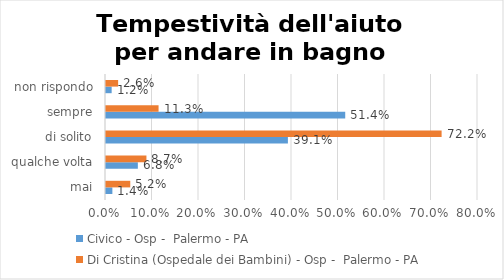
| Category | Civico - Osp -  Palermo - PA | Di Cristina (Ospedale dei Bambini) - Osp -  Palermo - PA |
|---|---|---|
| mai | 0.014 | 0.052 |
| qualche volta | 0.068 | 0.087 |
| di solito | 0.391 | 0.722 |
| sempre | 0.514 | 0.113 |
| non rispondo | 0.012 | 0.026 |